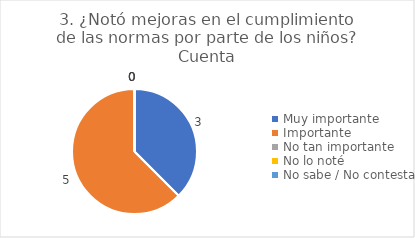
| Category | 3. ¿Notó mejoras en el cumplimiento de las normas por parte de los niños? |
|---|---|
| Muy importante  | 0.375 |
| Importante  | 0.625 |
| No tan importante  | 0 |
| No lo noté  | 0 |
| No sabe / No contesta | 0 |